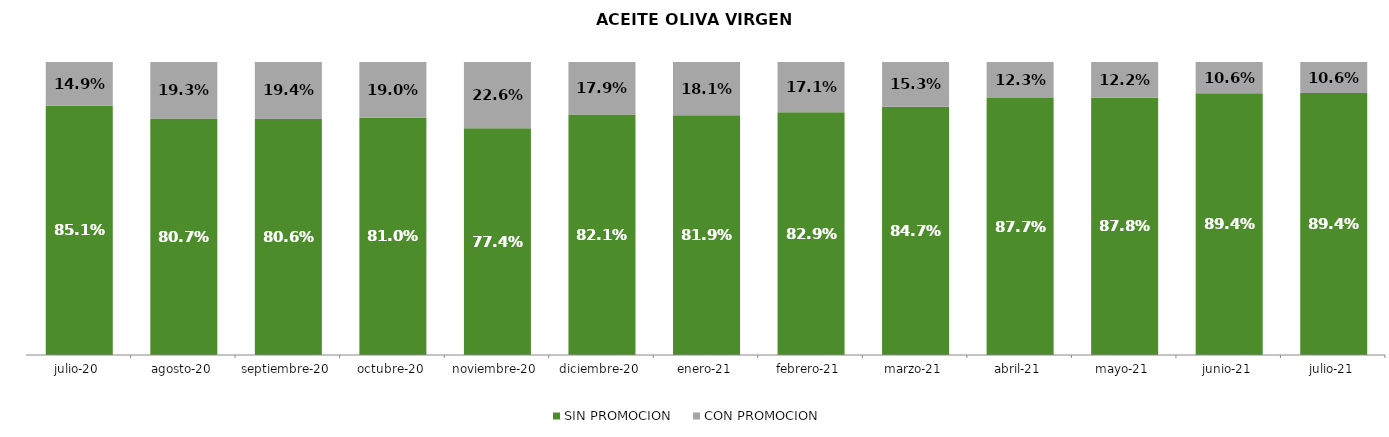
| Category | SIN PROMOCION   | CON PROMOCION   |
|---|---|---|
| 2020-07-01 | 0.851 | 0.149 |
| 2020-08-01 | 0.807 | 0.193 |
| 2020-09-01 | 0.806 | 0.194 |
| 2020-10-01 | 0.81 | 0.19 |
| 2020-11-01 | 0.774 | 0.226 |
| 2020-12-01 | 0.821 | 0.179 |
| 2021-01-01 | 0.819 | 0.181 |
| 2021-02-01 | 0.829 | 0.171 |
| 2021-03-01 | 0.847 | 0.153 |
| 2021-04-01 | 0.877 | 0.123 |
| 2021-05-01 | 0.878 | 0.122 |
| 2021-06-01 | 0.894 | 0.106 |
| 2021-07-01 | 0.894 | 0.106 |